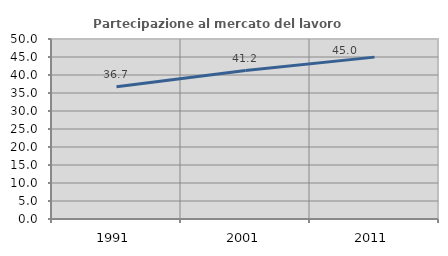
| Category | Partecipazione al mercato del lavoro  femminile |
|---|---|
| 1991.0 | 36.71 |
| 2001.0 | 41.242 |
| 2011.0 | 44.963 |